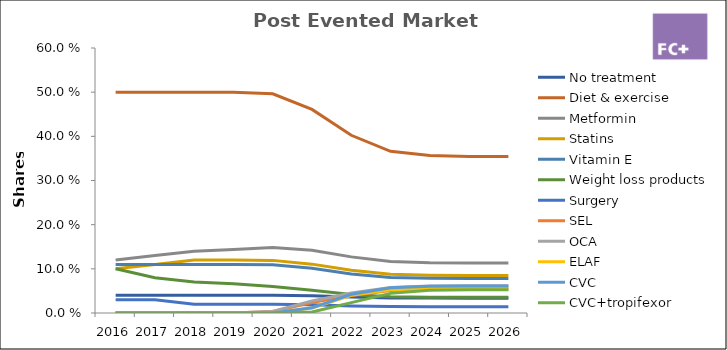
| Category | No treatment | Diet & exercise | Metformin | Statins | Vitamin E | Weight loss products | Surgery | SEL | OCA | ELAF | CVC | CVC+tropifexor |
|---|---|---|---|---|---|---|---|---|---|---|---|---|
| 2016.0 | 0.04 | 0.5 | 0.12 | 0.1 | 0.11 | 0.1 | 0.03 | 0 | 0 | 0 | 0 | 0 |
| 2017.0 | 0.04 | 0.5 | 0.13 | 0.11 | 0.11 | 0.08 | 0.03 | 0 | 0 | 0 | 0 | 0 |
| 2018.0 | 0.04 | 0.5 | 0.14 | 0.12 | 0.11 | 0.07 | 0.02 | 0 | 0 | 0 | 0 | 0 |
| 2019.0 | 0.04 | 0.5 | 0.144 | 0.12 | 0.11 | 0.066 | 0.02 | 0 | 0 | 0 | 0 | 0 |
| 2020.0 | 0.04 | 0.496 | 0.148 | 0.119 | 0.109 | 0.06 | 0.02 | 0.003 | 0.004 | 0 | 0 | 0 |
| 2021.0 | 0.039 | 0.461 | 0.142 | 0.111 | 0.101 | 0.051 | 0.018 | 0.024 | 0.027 | 0.011 | 0.012 | 0.002 |
| 2022.0 | 0.036 | 0.402 | 0.127 | 0.097 | 0.089 | 0.042 | 0.016 | 0.04 | 0.045 | 0.04 | 0.043 | 0.023 |
| 2023.0 | 0.034 | 0.366 | 0.117 | 0.088 | 0.081 | 0.037 | 0.015 | 0.051 | 0.058 | 0.053 | 0.057 | 0.044 |
| 2024.0 | 0.034 | 0.356 | 0.114 | 0.086 | 0.078 | 0.036 | 0.014 | 0.054 | 0.061 | 0.055 | 0.06 | 0.052 |
| 2025.0 | 0.034 | 0.354 | 0.113 | 0.085 | 0.078 | 0.035 | 0.014 | 0.054 | 0.062 | 0.056 | 0.061 | 0.053 |
| 2026.0 | 0.034 | 0.354 | 0.113 | 0.085 | 0.078 | 0.035 | 0.014 | 0.054 | 0.062 | 0.056 | 0.061 | 0.053 |